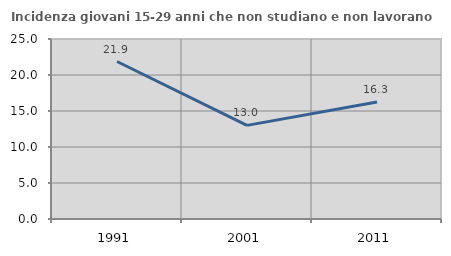
| Category | Incidenza giovani 15-29 anni che non studiano e non lavorano  |
|---|---|
| 1991.0 | 21.875 |
| 2001.0 | 13.002 |
| 2011.0 | 16.251 |